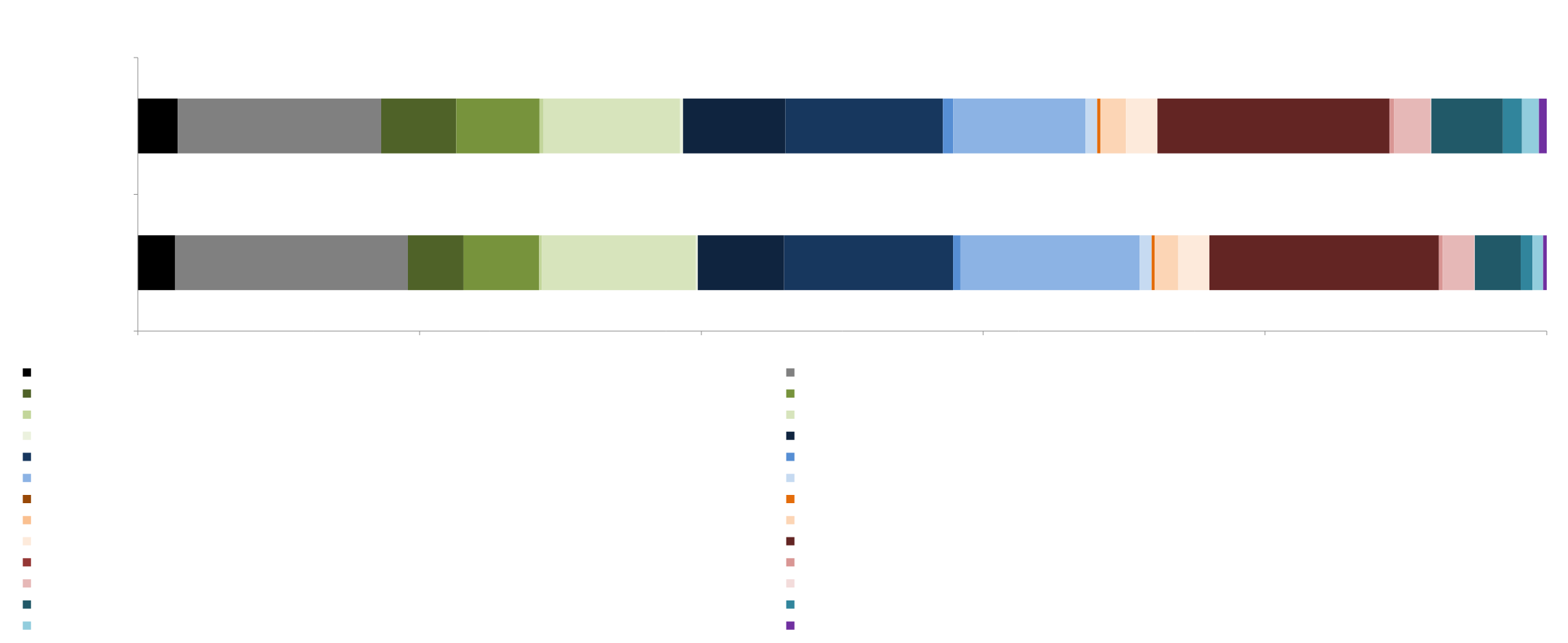
| Category | Geen diploma | 1.Lager onderwijs | 2.1.Lager middelbaar algemeen vormend (ASO) | 2.2.Lager middelbaar technisch (TSO) | 2.3.Lager middelbaar kunst (KSO) | 2.4.Lager middelbaar beroeps (BSO) | 2.5.Lager middelbaar (detail niet gekend) | 3.1.Hoger middelbaar algemeen vormend (ASO) | 3.2.Hoger middelbaar technisch (TSO) | 3.3.Hoger middelbaar kunst (KSO) | 3.4.Hoger middelbaar beroeps (BSO) | 3.5.Hoger middelbaar (detail niet gekend) | 4.1.Post-secundair niet-hoger onderwijs: algemeen | 4.2.Post-secundair niet-hoger onderwijs: technisch | 4.3.Post-secundair niet-hoger onderwijs: kunst | 4.4.Post-secundair niet-hoger onderwijs: beroeps | 4.5.Post-secundair niet-hoger onderwijs (detail niet gekend) | 5.1.Hogescholen onderwijs korte type (1 cyclus), graduaat (A1), professionele bachelor | 5.2.Academische bachelor aan een hogeschool | 5.3.Voortgezette of aanvullende opleiding na graduaat of bachelor (specialisatie, Banaba, …) | 5.4.Hogescholen onderwijs van het lange type (2 cycli), master aan een hogeschool | 5.5.Academische bachelor aan een universiteit | 5.6.Universitair onderwijs: licentiaat, ingenieur, master, … | 5.7.Voortgezette of aanvullende opleiding na licentiaat, ingenieur, master (specialisatie, Manama,…) | 5.8.Hoger onderwijs (detail niet gekend) | 6.Doctoraat met proefschrift |
|---|---|---|---|---|---|---|---|---|---|---|---|---|---|---|---|---|---|---|---|---|---|---|---|---|---|---|
| Vorselaar | 797 | 4956 | 1182 | 1614 | 60 | 3275 | 42 | 1838 | 3599 | 158 | 3818 | 253 | 0 | 67 | 0 | 501 | 662 | 4887 | 4 | 80 | 673 | 9 | 977 | 251 | 227 | 77 |
| Vlaams Gewest | 126033 | 643940 | 237404 | 263446 | 12753 | 431812 | 9567 | 323543 | 498662 | 32856 | 418562 | 36611 | 51 | 9981 | 161 | 80919 | 99468 | 733960 | 1438 | 12694 | 116097 | 2242 | 226100 | 60598 | 53778 | 24757 |